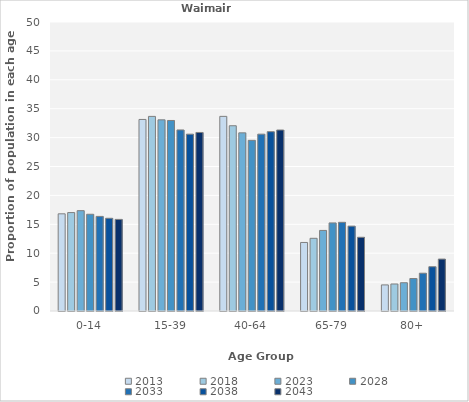
| Category | 2013 | 2018 | 2023 | 2028 | 2033 | 2038 | 2043 |
|---|---|---|---|---|---|---|---|
| 0-14 | 16.814 | 17.031 | 17.359 | 16.738 | 16.368 | 16.043 | 15.847 |
| 15-39 | 33.142 | 33.668 | 33.074 | 32.961 | 31.325 | 30.596 | 30.89 |
| 40-64 | 33.673 | 32.052 | 30.823 | 29.528 | 30.598 | 31.021 | 31.314 |
| 65-79 | 11.858 | 12.576 | 13.939 | 15.236 | 15.342 | 14.681 | 12.754 |
| 80+ | 4.513 | 4.672 | 4.892 | 5.622 | 6.538 | 7.66 | 8.983 |